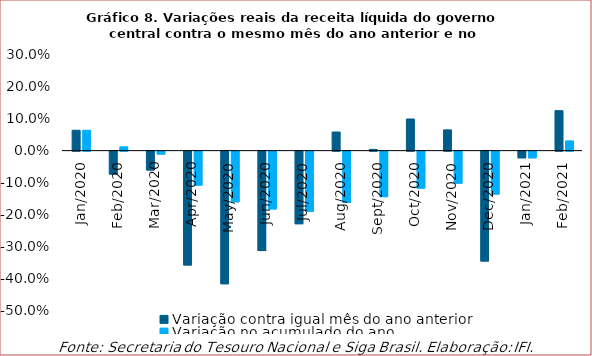
| Category | Variação contra igual mês do ano anterior | Variação no acumulado do ano |
|---|---|---|
| 2020-01-01 | 0.064 | 0.064 |
| 2020-02-01 | -0.072 | 0.012 |
| 2020-03-01 | -0.059 | -0.009 |
| 2020-04-01 | -0.357 | -0.107 |
| 2020-05-01 | -0.416 | -0.159 |
| 2020-06-01 | -0.312 | -0.181 |
| 2020-07-01 | -0.228 | -0.189 |
| 2020-08-01 | 0.058 | -0.161 |
| 2020-09-01 | 0.004 | -0.143 |
| 2020-10-01 | 0.099 | -0.116 |
| 2020-11-01 | 0.065 | -0.1 |
| 2020-12-01 | -0.345 | -0.135 |
| 2021-01-01 | -0.021 | -0.021 |
| 2021-02-01 | 0.125 | 0.03 |